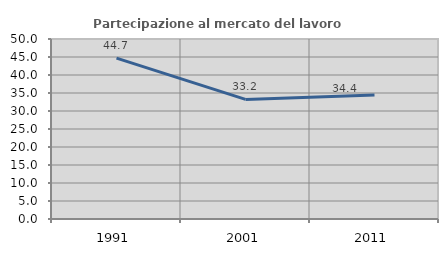
| Category | Partecipazione al mercato del lavoro  femminile |
|---|---|
| 1991.0 | 44.706 |
| 2001.0 | 33.219 |
| 2011.0 | 34.436 |